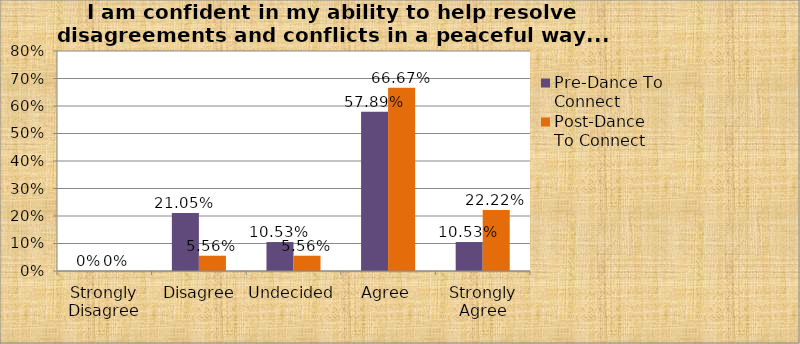
| Category | Pre-Dance To Connect | Post-Dance To Connect |
|---|---|---|
| Strongly Disagree | 0 | 0 |
|  Disagree | 0.21 | 0.056 |
| Undecided | 0.105 | 0.056 |
| Agree | 0.579 | 0.667 |
| Strongly Agree | 0.105 | 0.222 |